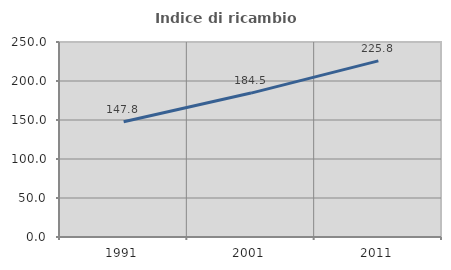
| Category | Indice di ricambio occupazionale  |
|---|---|
| 1991.0 | 147.761 |
| 2001.0 | 184.507 |
| 2011.0 | 225.806 |